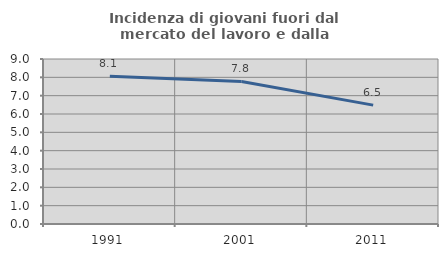
| Category | Incidenza di giovani fuori dal mercato del lavoro e dalla formazione  |
|---|---|
| 1991.0 | 8.059 |
| 2001.0 | 7.776 |
| 2011.0 | 6.485 |